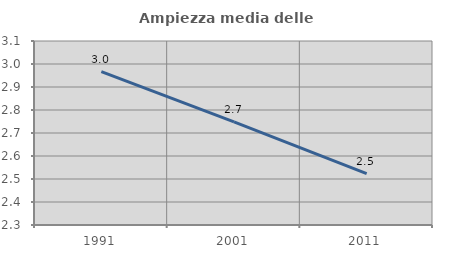
| Category | Ampiezza media delle famiglie |
|---|---|
| 1991.0 | 2.967 |
| 2001.0 | 2.748 |
| 2011.0 | 2.523 |